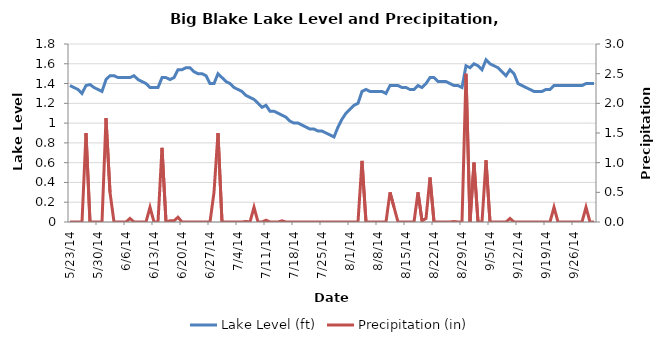
| Category | Lake Level (ft) |
|---|---|
| 5/23/14 | 1.38 |
| 5/24/14 | 1.36 |
| 5/25/14 | 1.34 |
| 5/26/14 | 1.3 |
| 5/27/14 | 1.38 |
| 5/28/14 | 1.39 |
| 5/29/14 | 1.36 |
| 5/30/14 | 1.34 |
| 5/31/14 | 1.32 |
| 6/1/14 | 1.44 |
| 6/2/14 | 1.48 |
| 6/3/14 | 1.48 |
| 6/4/14 | 1.46 |
| 6/5/14 | 1.46 |
| 6/6/14 | 1.46 |
| 6/7/14 | 1.46 |
| 6/8/14 | 1.48 |
| 6/9/14 | 1.44 |
| 6/10/14 | 1.42 |
| 6/11/14 | 1.4 |
| 6/12/14 | 1.36 |
| 6/13/14 | 1.36 |
| 6/14/14 | 1.36 |
| 6/15/14 | 1.46 |
| 6/16/14 | 1.46 |
| 6/17/14 | 1.44 |
| 6/18/14 | 1.46 |
| 6/19/14 | 1.54 |
| 6/20/14 | 1.54 |
| 6/21/14 | 1.56 |
| 6/22/14 | 1.56 |
| 6/23/14 | 1.52 |
| 6/24/14 | 1.5 |
| 6/25/14 | 1.5 |
| 6/26/14 | 1.48 |
| 6/27/14 | 1.4 |
| 6/28/14 | 1.4 |
| 6/29/14 | 1.5 |
| 6/30/14 | 1.46 |
| 7/1/14 | 1.42 |
| 7/2/14 | 1.4 |
| 7/3/14 | 1.36 |
| 7/4/14 | 1.34 |
| 7/5/14 | 1.32 |
| 7/6/14 | 1.28 |
| 7/7/14 | 1.26 |
| 7/8/14 | 1.24 |
| 7/9/14 | 1.2 |
| 7/10/14 | 1.16 |
| 7/11/14 | 1.18 |
| 7/12/14 | 1.12 |
| 7/13/14 | 1.12 |
| 7/14/14 | 1.1 |
| 7/15/14 | 1.08 |
| 7/16/14 | 1.06 |
| 7/17/14 | 1.02 |
| 7/18/14 | 1 |
| 7/19/14 | 1 |
| 7/20/14 | 0.98 |
| 7/21/14 | 0.96 |
| 7/22/14 | 0.94 |
| 7/23/14 | 0.94 |
| 7/24/14 | 0.92 |
| 7/25/14 | 0.92 |
| 7/26/14 | 0.9 |
| 7/27/14 | 0.88 |
| 7/28/14 | 0.86 |
| 7/29/14 | 0.96 |
| 7/30/14 | 1.04 |
| 7/31/14 | 1.1 |
| 8/1/14 | 1.14 |
| 8/2/14 | 1.18 |
| 8/3/14 | 1.2 |
| 8/4/14 | 1.32 |
| 8/5/14 | 1.34 |
| 8/6/14 | 1.32 |
| 8/7/14 | 1.32 |
| 8/8/14 | 1.32 |
| 8/9/14 | 1.32 |
| 8/10/14 | 1.3 |
| 8/11/14 | 1.38 |
| 8/12/14 | 1.38 |
| 8/13/14 | 1.38 |
| 8/14/14 | 1.36 |
| 8/15/14 | 1.36 |
| 8/16/14 | 1.34 |
| 8/17/14 | 1.34 |
| 8/18/14 | 1.38 |
| 8/19/14 | 1.36 |
| 8/20/14 | 1.4 |
| 8/21/14 | 1.46 |
| 8/22/14 | 1.46 |
| 8/23/14 | 1.42 |
| 8/24/14 | 1.42 |
| 8/25/14 | 1.42 |
| 8/26/14 | 1.4 |
| 8/27/14 | 1.38 |
| 8/28/14 | 1.38 |
| 8/29/14 | 1.36 |
| 8/30/14 | 1.58 |
| 8/31/14 | 1.56 |
| 9/1/14 | 1.6 |
| 9/2/14 | 1.58 |
| 9/3/14 | 1.54 |
| 9/4/14 | 1.64 |
| 9/5/14 | 1.6 |
| 9/6/14 | 1.58 |
| 9/7/14 | 1.56 |
| 9/8/14 | 1.52 |
| 9/9/14 | 1.48 |
| 9/10/14 | 1.54 |
| 9/11/14 | 1.5 |
| 9/12/14 | 1.4 |
| 9/13/14 | 1.38 |
| 9/14/14 | 1.36 |
| 9/15/14 | 1.34 |
| 9/16/14 | 1.32 |
| 9/17/14 | 1.32 |
| 9/18/14 | 1.32 |
| 9/19/14 | 1.34 |
| 9/20/14 | 1.34 |
| 9/21/14 | 1.38 |
| 9/22/14 | 1.38 |
| 9/23/14 | 1.38 |
| 9/24/14 | 1.38 |
| 9/25/14 | 1.38 |
| 9/26/14 | 1.38 |
| 9/27/14 | 1.38 |
| 9/28/14 | 1.38 |
| 9/29/14 | 1.4 |
| 9/30/14 | 1.4 |
| 10/1/14 | 1.4 |